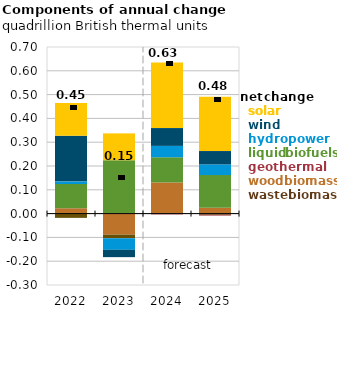
| Category | Wood biomass | Other biomass | Geothermal | Liquid biofuels | Hydropower | Wind power | Solar |
|---|---|---|---|---|---|---|---|
| 2022.0 | 0.022 | -0.018 | 0 | 0.102 | 0.011 | 0.191 | 0.138 |
| 2023.0 | -0.089 | -0.015 | 0.001 | 0.223 | -0.048 | -0.031 | 0.113 |
| 2024.0 | 0.131 | -0.001 | -0.002 | 0.106 | 0.048 | 0.075 | 0.275 |
| 2025.0 | 0.024 | -0.005 | -0.004 | 0.137 | 0.045 | 0.056 | 0.228 |